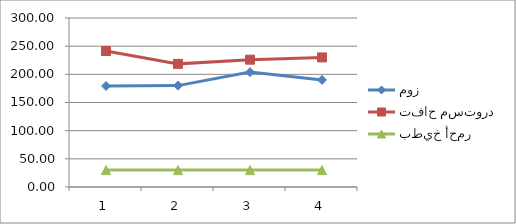
| Category | موز | تفاح مستورد | بطيخ أحمر |
|---|---|---|---|
| 0 | 179.286 | 241.429 | 30 |
| 1 | 180 | 218.571 | 30 |
| 2 | 204 | 226 | 30 |
| 3 | 190 | 230 | 30 |